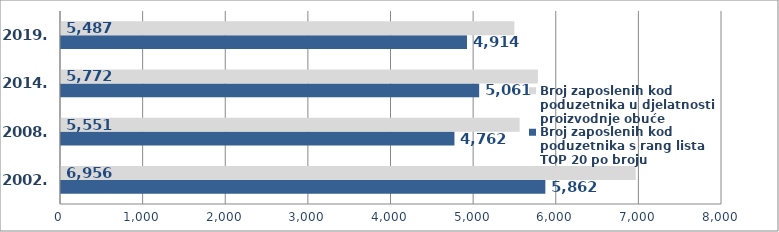
| Category | Broj zaposlenih kod poduzetnika s rang lista TOP 20 po broju zaposlenih  | Broj zaposlenih kod poduzetnika u djelatnosti proizvodnje obuće |
|---|---|---|
| 2002. | 5862 | 6956 |
| 2008. | 4762 | 5551 |
| 2014. | 5061 | 5772 |
| 2019. | 4914 | 5487 |